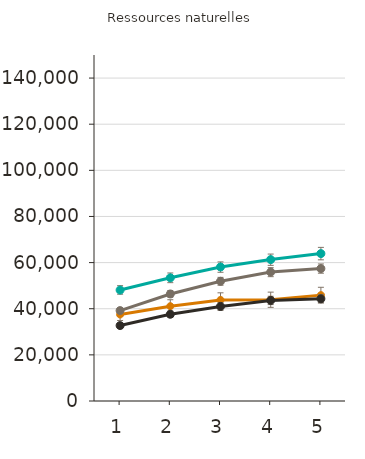
| Category | Certificat d'études collégial | Diplôme d'études collégial | Baccalauréat | Maîtrise | Doctorat | Grade professionnel |
|---|---|---|---|---|---|---|
| 1.0 | 37500 | 32700 | 39200 | 48100 |  |  |
| 2.0 | 41100 | 37600 | 46400 | 53400 |  |  |
| 3.0 | 43800 | 41000 | 51900 | 58100 |  |  |
| 4.0 | 43900 | 43600 | 55900 | 61300 |  |  |
| 5.0 | 45900 | 44300 | 57400 | 63900 |  |  |